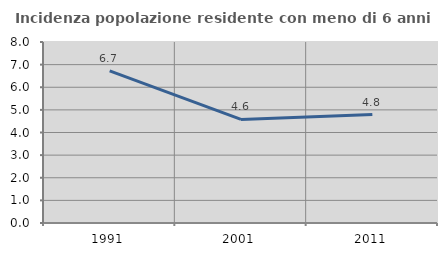
| Category | Incidenza popolazione residente con meno di 6 anni |
|---|---|
| 1991.0 | 6.724 |
| 2001.0 | 4.577 |
| 2011.0 | 4.792 |